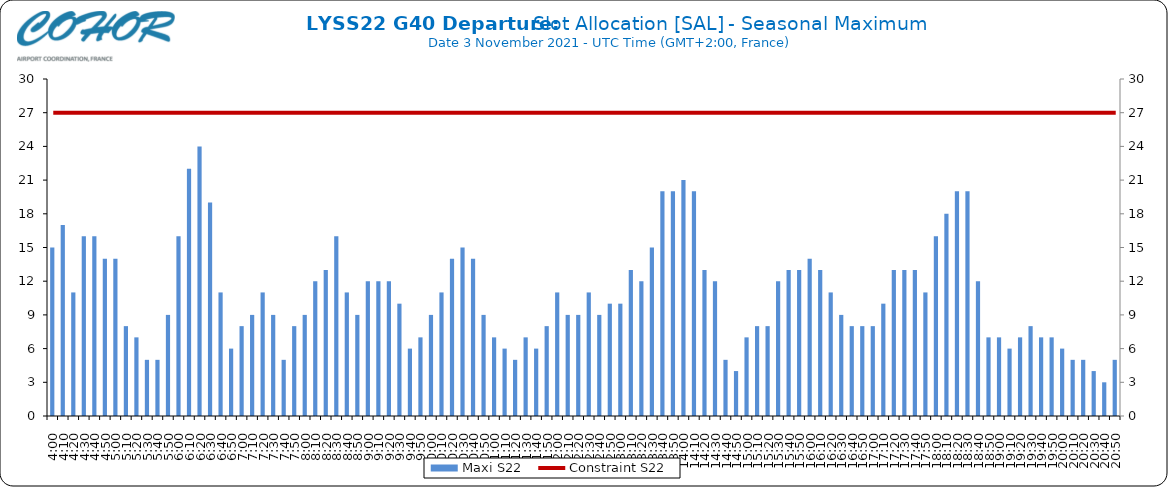
| Category | Maxi S22 |
|---|---|
| 0.16666666666666666 | 15 |
| 0.17361111111111113 | 17 |
| 0.18055555555555555 | 11 |
| 0.1875 | 16 |
| 0.19444444444444445 | 16 |
| 0.20138888888888887 | 14 |
| 0.20833333333333334 | 14 |
| 0.2152777777777778 | 8 |
| 0.2222222222222222 | 7 |
| 0.22916666666666666 | 5 |
| 0.23611111111111113 | 5 |
| 0.24305555555555555 | 9 |
| 0.25 | 16 |
| 0.2569444444444445 | 22 |
| 0.2638888888888889 | 24 |
| 0.2708333333333333 | 19 |
| 0.2777777777777778 | 11 |
| 0.2847222222222222 | 6 |
| 0.2916666666666667 | 8 |
| 0.2986111111111111 | 9 |
| 0.3055555555555555 | 11 |
| 0.3125 | 9 |
| 0.3194444444444445 | 5 |
| 0.3263888888888889 | 8 |
| 0.3333333333333333 | 9 |
| 0.34027777777777773 | 12 |
| 0.34722222222222227 | 13 |
| 0.3541666666666667 | 16 |
| 0.3611111111111111 | 11 |
| 0.3680555555555556 | 9 |
| 0.375 | 12 |
| 0.3819444444444444 | 12 |
| 0.3888888888888889 | 12 |
| 0.3958333333333333 | 10 |
| 0.40277777777777773 | 6 |
| 0.40972222222222227 | 7 |
| 0.4166666666666667 | 9 |
| 0.4236111111111111 | 11 |
| 0.4305555555555556 | 14 |
| 0.4375 | 15 |
| 0.4444444444444444 | 14 |
| 0.4513888888888889 | 9 |
| 0.4583333333333333 | 7 |
| 0.46527777777777773 | 6 |
| 0.47222222222222227 | 5 |
| 0.4791666666666667 | 7 |
| 0.4861111111111111 | 6 |
| 0.4930555555555556 | 8 |
| 0.5 | 11 |
| 0.5069444444444444 | 9 |
| 0.513888888888889 | 9 |
| 0.5208333333333334 | 11 |
| 0.5277777777777778 | 9 |
| 0.5347222222222222 | 10 |
| 0.5416666666666666 | 10 |
| 0.548611111111111 | 13 |
| 0.5555555555555556 | 12 |
| 0.5625 | 15 |
| 0.5694444444444444 | 20 |
| 0.576388888888889 | 20 |
| 0.5833333333333334 | 21 |
| 0.5902777777777778 | 20 |
| 0.5972222222222222 | 13 |
| 0.6041666666666666 | 12 |
| 0.611111111111111 | 5 |
| 0.6180555555555556 | 4 |
| 0.625 | 7 |
| 0.6319444444444444 | 8 |
| 0.638888888888889 | 8 |
| 0.6458333333333334 | 12 |
| 0.6527777777777778 | 13 |
| 0.6597222222222222 | 13 |
| 0.6666666666666666 | 14 |
| 0.6736111111111112 | 13 |
| 0.6805555555555555 | 11 |
| 0.6875 | 9 |
| 0.6944444444444445 | 8 |
| 0.7013888888888888 | 8 |
| 0.7083333333333334 | 8 |
| 0.7152777777777778 | 10 |
| 0.7222222222222222 | 13 |
| 0.7291666666666666 | 13 |
| 0.7361111111111112 | 13 |
| 0.7430555555555555 | 11 |
| 0.75 | 16 |
| 0.7569444444444445 | 18 |
| 0.7638888888888888 | 20 |
| 0.7708333333333334 | 20 |
| 0.7777777777777778 | 12 |
| 0.7847222222222222 | 7 |
| 0.7916666666666666 | 7 |
| 0.7986111111111112 | 6 |
| 0.8055555555555555 | 7 |
| 0.8125 | 8 |
| 0.8194444444444445 | 7 |
| 0.8263888888888888 | 7 |
| 0.8333333333333334 | 6 |
| 0.8402777777777778 | 5 |
| 0.8472222222222222 | 5 |
| 0.8541666666666666 | 4 |
| 0.8611111111111112 | 3 |
| 0.8680555555555555 | 5 |